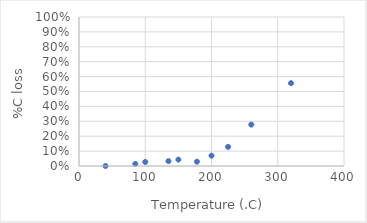
| Category | Total C (mg/g) |
|---|---|
| 40.0 | 0 |
| 85.0 | 0.014 |
| 100.0 | 0.027 |
| 135.0 | 0.033 |
| 150.0 | 0.043 |
| 178.0 | 0.029 |
| 200.0 | 0.069 |
| 225.0 | 0.128 |
| 260.0 | 0.278 |
| 320.0 | 0.556 |